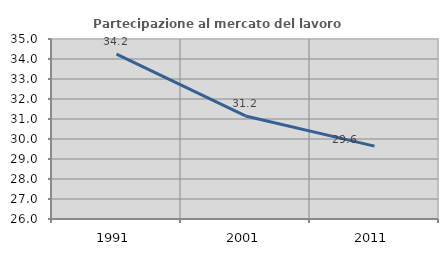
| Category | Partecipazione al mercato del lavoro  femminile |
|---|---|
| 1991.0 | 34.241 |
| 2001.0 | 31.152 |
| 2011.0 | 29.642 |